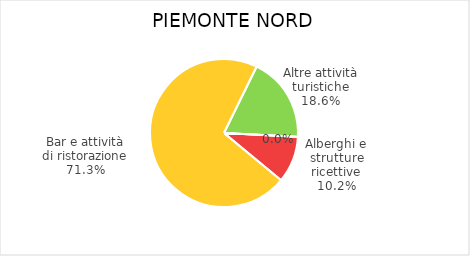
| Category | Piemonte Nord |
|---|---|
| Alberghi e strutture ricettive | 900 |
| Bar e attività di ristorazione | 6312 |
| Altre attività turistiche | 1644 |